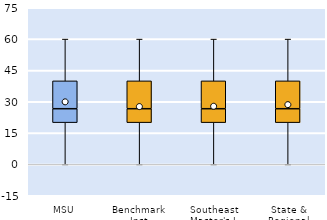
| Category | 25th | 50th | 75th |
|---|---|---|---|
| MSU | 20 | 6.667 | 13.333 |
| Benchmark Inst | 20 | 6.667 | 13.333 |
| Southeast Master's-L | 20 | 6.667 | 13.333 |
| State & Regional | 20 | 6.667 | 13.333 |